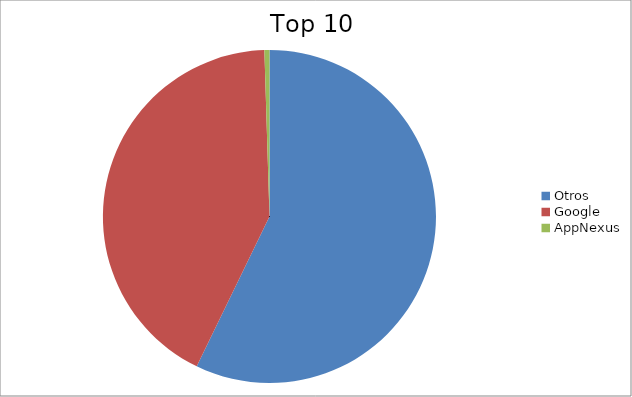
| Category | Series 0 |
|---|---|
| Otros | 57.2 |
| Google | 42.31 |
| AppNexus | 0.49 |